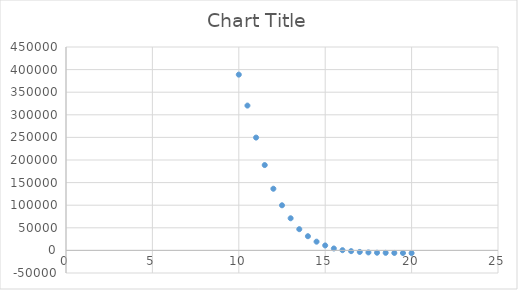
| Category | Series 0 |
|---|---|
| 20.0 | -5956.37 |
| 19.5 | -5795.02 |
| 19.0 | -5624.61 |
| 18.5 | -5366.98 |
| 18.0 | -5140.62 |
| 17.5 | -4477.41 |
| 17.0 | -3381.85 |
| 16.5 | -1665.54 |
| 16.0 | 498.48 |
| 15.5 | 4215.47 |
| 15.0 | 10961.55 |
| 14.5 | 19318.34 |
| 14.0 | 31381.55 |
| 13.5 | 46936.93 |
| 13.0 | 71074.34 |
| 12.5 | 99802.33 |
| 12.0 | 136425.46 |
| 11.5 | 188799.78 |
| 11.0 | 249599.28 |
| 10.5 | 320390.9 |
| 10.0 | 388848.78 |